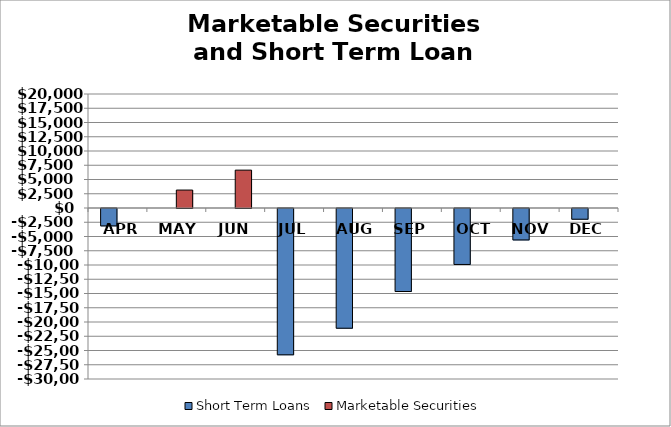
| Category | Short Term Loans | Marketable Securities |
|---|---|---|
| APR | -3052.5 | 0 |
| MAY | 0 | 3147.5 |
| JUN | 0 | 6642.5 |
| JUL | -25670.5 | 0 |
| AUG | -21005.5 | 0 |
| SEP | -14562.5 | 0 |
| OCT | -9817.5 | 0 |
| NOV | -5517.5 | 0 |
| DEC | -1882.5 | 0 |